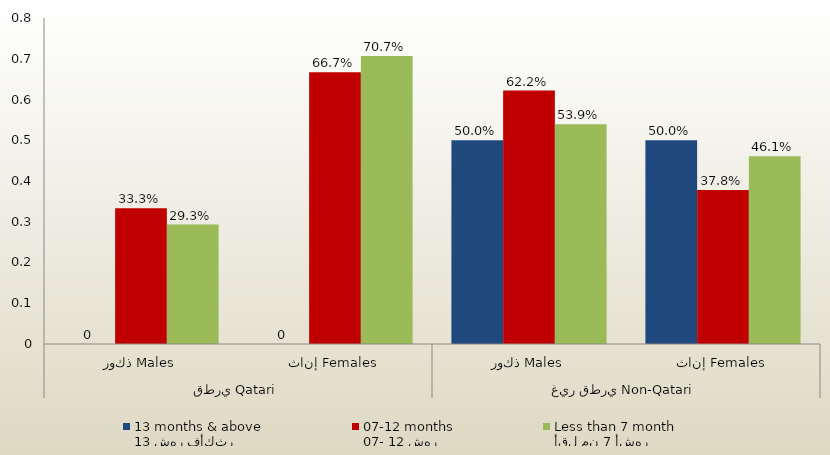
| Category | 13 شهر فأكثر
13 months & above | 07- 12 شهر
07-12 months | أقل من 7 أشهر
Less than 7 month  |
|---|---|---|---|
| 0 | 0 | 0.333 | 0.293 |
| 1 | 0 | 0.667 | 0.707 |
| 2 | 0.5 | 0.622 | 0.539 |
| 3 | 0.5 | 0.378 | 0.461 |